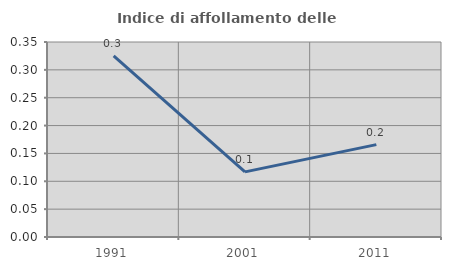
| Category | Indice di affollamento delle abitazioni  |
|---|---|
| 1991.0 | 0.325 |
| 2001.0 | 0.117 |
| 2011.0 | 0.166 |